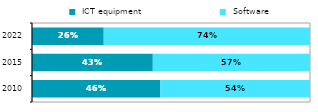
| Category |  ICT equipment |  Software |
|---|---|---|
| 2010.0 | 0.462 | 0.538 |
| 2015.0 | 0.435 | 0.565 |
| 2022.0 | 0.258 | 0.742 |